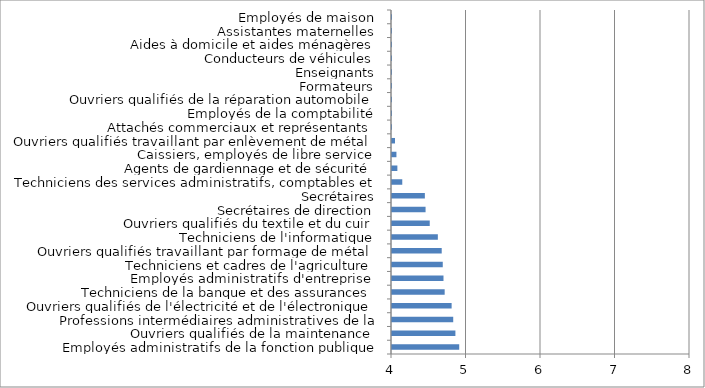
| Category | Series 0 |
|---|---|
| Employés administratifs de la fonction publique (catégorie C et assimilés) | 4.902 |
| Ouvriers qualifiés de la maintenance | 4.851 |
| Professions intermédiaires administratives de la fonction publique (catégorie B et assimil | 4.822 |
| Ouvriers qualifiés de l'électricité et de l'électronique | 4.8 |
| Techniciens de la banque et des assurances | 4.707 |
| Employés administratifs d'entreprise | 4.691 |
| Techniciens et cadres de l'agriculture | 4.681 |
| Ouvriers qualifiés travaillant par formage de métal | 4.667 |
| Techniciens de l'informatique | 4.615 |
| Ouvriers qualifiés du textile et du cuir | 4.507 |
| Secrétaires de direction | 4.451 |
| Secrétaires | 4.441 |
| Techniciens des services administratifs, comptables et financiers | 4.138 |
| Agents de gardiennage et de sécurité | 4.072 |
| Caissiers, employés de libre service | 4.06 |
| Ouvriers qualifiés travaillant par enlèvement de métal | 4.04 |
| Attachés commerciaux et représentants | 3.802 |
| Employés de la comptabilité | 3.799 |
| Ouvriers qualifiés de la réparation automobile | 3.79 |
| Formateurs | 3.737 |
| Enseignants | 3.618 |
| Conducteurs de véhicules | 3.311 |
| Aides à domicile et aides ménagères | 1.73 |
| Assistantes maternelles | 1.599 |
| Employés de maison | 0.704 |